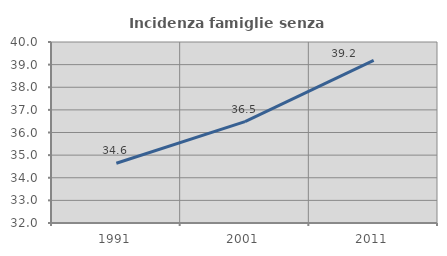
| Category | Incidenza famiglie senza nuclei |
|---|---|
| 1991.0 | 34.641 |
| 2001.0 | 36.482 |
| 2011.0 | 39.189 |